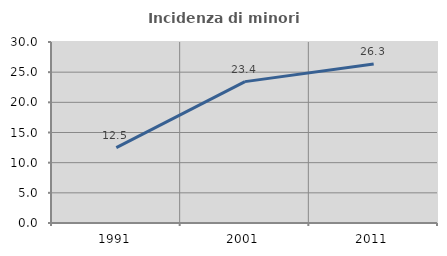
| Category | Incidenza di minori stranieri |
|---|---|
| 1991.0 | 12.5 |
| 2001.0 | 23.431 |
| 2011.0 | 26.349 |